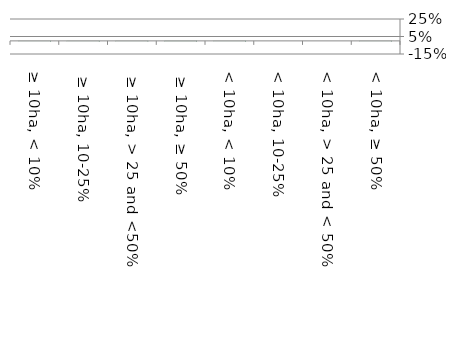
| Category | Not determinable |
|---|---|
|  ≥ 10ha, < 10%  | 0 |
|   ≥ 10ha, 10-25% | 0 |
|   ≥ 10ha, > 25 and <50%  | 0 |
|   ≥ 10ha, ≥ 50%  | 0.006 |
|  < 10ha, < 10% | 0 |
|  < 10ha, 10-25% | 0 |
|  < 10ha, > 25 and < 50% | 0 |
|  < 10ha, ≥ 50% | 0 |